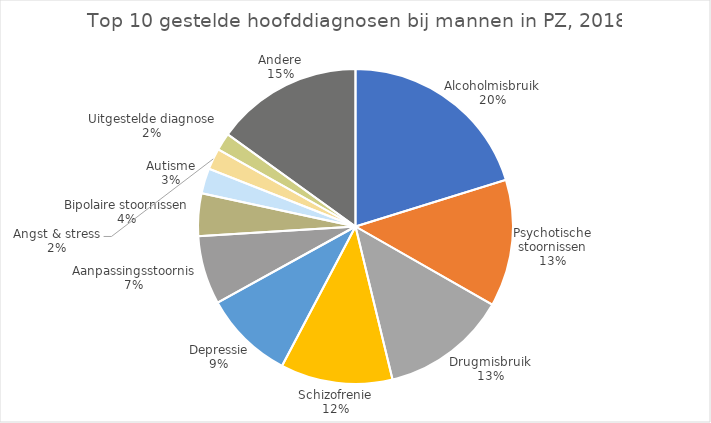
| Category | Aantal verblijven |
|---|---|
| Alcoholmisbruik | 5640 |
| Psychotische stoornissen | 3641 |
| Drugmisbruik | 3616 |
| Schizofrenie | 3208 |
| Depressie | 2578 |
| Aanpassingsstoornis | 1971 |
| Bipolaire stoornissen | 1218 |
| Autisme | 722 |
| Angst & stress | 604 |
| Uitgestelde diagnose | 503 |
| Andere | 4201 |